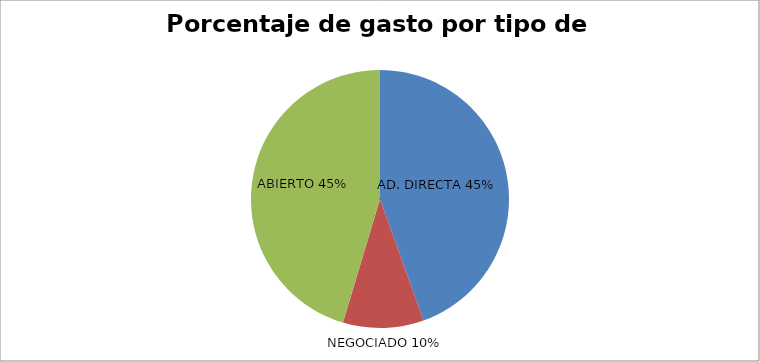
| Category | Series 0 |
|---|---|
| 0 | 6411096.95 |
| 1 | 1455987.47 |
| 2 | 6532057.35 |